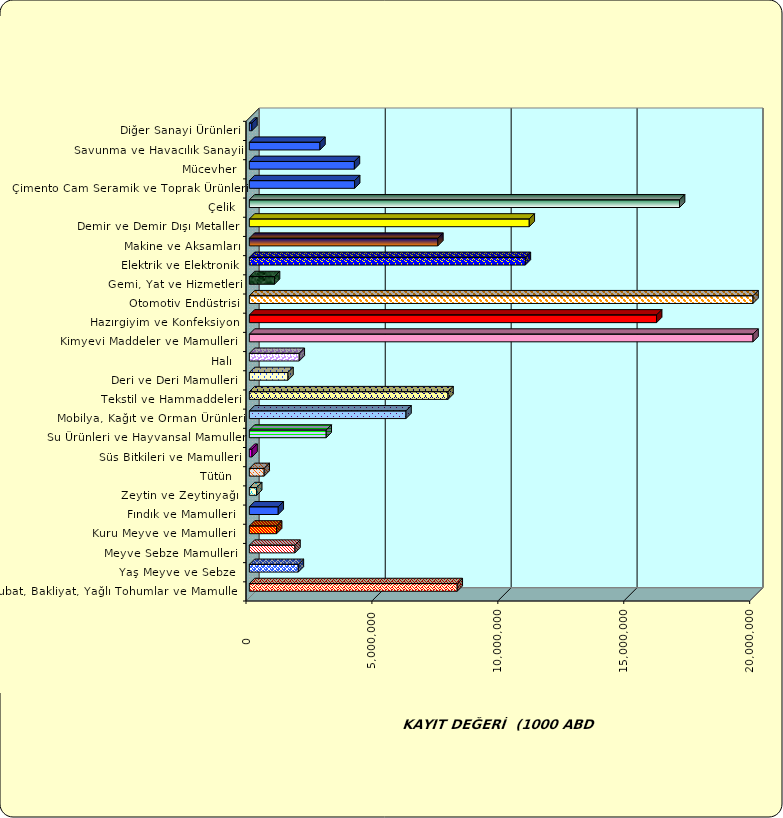
| Category | Series 0 |
|---|---|
|  Hububat, Bakliyat, Yağlı Tohumlar ve Mamulleri  | 8254243.954 |
|  Yaş Meyve ve Sebze   | 1944830.305 |
|  Meyve Sebze Mamulleri  | 1811293.506 |
|  Kuru Meyve ve Mamulleri   | 1082383.796 |
|  Fındık ve Mamulleri  | 1147171.334 |
|  Zeytin ve Zeytinyağı  | 290304.52 |
|  Tütün  | 588476.284 |
|  Süs Bitkileri ve Mamulleri | 106058.358 |
|  Su Ürünleri ve Hayvansal Mamuller | 3051897.413 |
|  Mobilya, Kağıt ve Orman Ürünleri | 6220068.838 |
|  Tekstil ve Hammaddeleri | 7888036.589 |
|  Deri ve Deri Mamulleri  | 1534175.742 |
|  Halı  | 1981387.837 |
|  Kimyevi Maddeler ve Mamulleri   | 25540664.886 |
|  Hazırgiyim ve Konfeksiyon  | 16171563.167 |
|  Otomotiv Endüstrisi | 22325154.227 |
|  Gemi, Yat ve Hizmetleri | 999150.653 |
|  Elektrik ve Elektronik | 10959556.831 |
|  Makine ve Aksamları | 7484964.853 |
|  Demir ve Demir Dışı Metaller  | 11114639.886 |
|  Çelik | 17082000.585 |
|  Çimento Cam Seramik ve Toprak Ürünleri | 4180454.046 |
|  Mücevher | 4171524.276 |
|  Savunma ve Havacılık Sanayii | 2803318.632 |
|  Diğer Sanayi Ürünleri | 100021.67 |